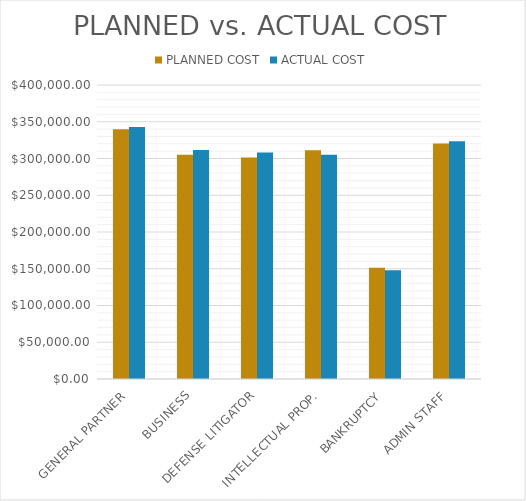
| Category | PLANNED COST | ACTUAL COST |
|---|---|---|
| GENERAL PARTNER | 339675 | 343000 |
| BUSINESS | 305250 | 311625 |
| DEFENSE LITIGATOR | 301500 | 308250 |
| INTELLECTUAL PROP. | 311300 | 304975 |
| BANKRUPTCY | 151200 | 148050 |
| ADMIN STAFF | 320562.5 | 323625 |